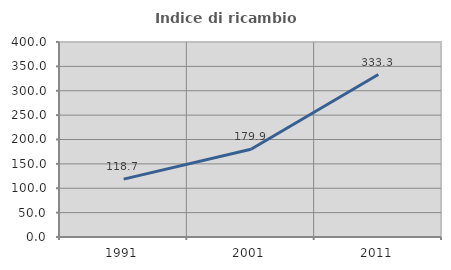
| Category | Indice di ricambio occupazionale  |
|---|---|
| 1991.0 | 118.71 |
| 2001.0 | 179.937 |
| 2011.0 | 333.333 |